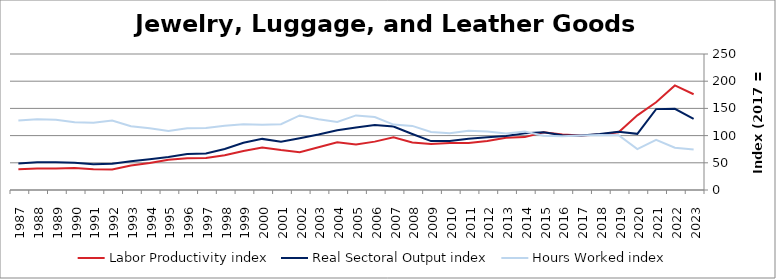
| Category | Labor Productivity index | Real Sectoral Output index | Hours Worked index |
|---|---|---|---|
| 2023.0 | 175.963 | 130.807 | 74.337 |
| 2022.0 | 192.165 | 149.258 | 77.672 |
| 2021.0 | 161.216 | 148.679 | 92.224 |
| 2020.0 | 137.218 | 103.257 | 75.25 |
| 2019.0 | 106.272 | 107.148 | 100.824 |
| 2018.0 | 102.041 | 103.023 | 100.963 |
| 2017.0 | 100 | 100 | 100 |
| 2016.0 | 101.973 | 100.621 | 98.674 |
| 2015.0 | 106.27 | 106.021 | 99.766 |
| 2014.0 | 97.222 | 104.313 | 107.293 |
| 2013.0 | 95.893 | 99.464 | 103.723 |
| 2012.0 | 89.96 | 96.901 | 107.716 |
| 2011.0 | 86.415 | 94.14 | 108.94 |
| 2010.0 | 86.389 | 90.025 | 104.208 |
| 2009.0 | 84.406 | 89.889 | 106.496 |
| 2008.0 | 87.296 | 102.886 | 117.859 |
| 2007.0 | 96.859 | 116.527 | 120.306 |
| 2006.0 | 88.927 | 119.25 | 134.098 |
| 2005.0 | 83.818 | 114.928 | 137.116 |
| 2004.0 | 87.656 | 109.662 | 125.105 |
| 2003.0 | 78.464 | 101.908 | 129.878 |
| 2002.0 | 69.556 | 95.323 | 137.045 |
| 2001.0 | 73.336 | 88.764 | 121.037 |
| 2000.0 | 78.236 | 93.958 | 120.095 |
| 1999.0 | 71.781 | 86.718 | 120.808 |
| 1998.0 | 63.911 | 75.477 | 118.097 |
| 1997.0 | 58.908 | 67.232 | 114.13 |
| 1996.0 | 58.417 | 66.309 | 113.51 |
| 1995.0 | 55.754 | 60.492 | 108.498 |
| 1994.0 | 49.771 | 56.516 | 113.55 |
| 1993.0 | 45.034 | 52.75 | 117.135 |
| 1992.0 | 37.684 | 48.136 | 127.737 |
| 1991.0 | 38.309 | 47.323 | 123.53 |
| 1990.0 | 40.377 | 50.229 | 124.398 |
| 1989.0 | 39.588 | 51.052 | 128.959 |
| 1988.0 | 39.342 | 51.105 | 129.899 |
| 1987.0 | 38.259 | 48.891 | 127.789 |